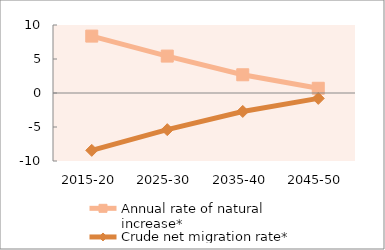
| Category | Annual rate of natural increase* | Crude net migration rate* |
|---|---|---|
| 2015-20 | 8.367 | -8.433 |
| 2025-30 | 5.429 | -5.395 |
| 2035-40 | 2.68 | -2.713 |
| 2045-50 | 0.695 | -0.794 |